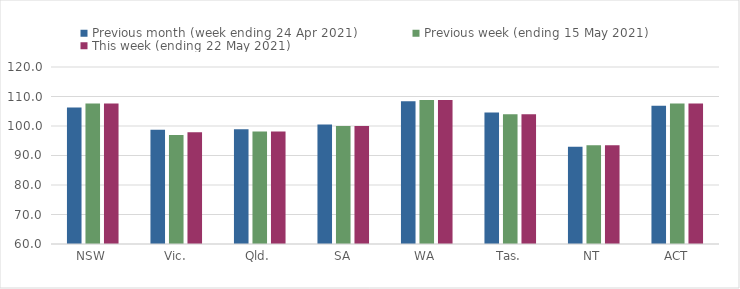
| Category | Previous month (week ending 24 Apr 2021) | Previous week (ending 15 May 2021) | This week (ending 22 May 2021) |
|---|---|---|---|
| NSW | 106.25 | 107.65 | 107.65 |
| Vic. | 98.7 | 96.95 | 97.88 |
| Qld. | 98.87 | 98.16 | 98.16 |
| SA | 100.52 | 100 | 100 |
| WA | 108.41 | 108.79 | 108.79 |
| Tas. | 104.61 | 104 | 104 |
| NT | 92.96 | 93.47 | 93.47 |
| ACT | 106.88 | 107.61 | 107.61 |